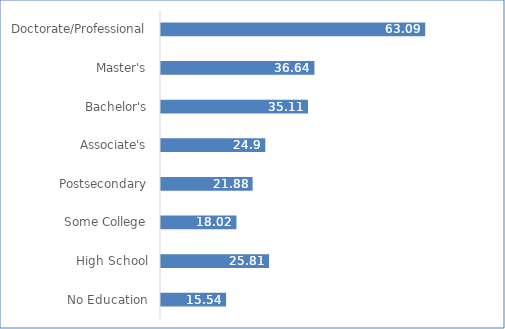
| Category | Series 0 |
|---|---|
| No Education | 15.54 |
| High School | 25.81 |
| Some College | 18.02 |
| Postsecondary | 21.88 |
| Associate's | 24.9 |
| Bachelor's | 35.11 |
| Master's | 36.64 |
| Doctorate/Professional | 63.09 |